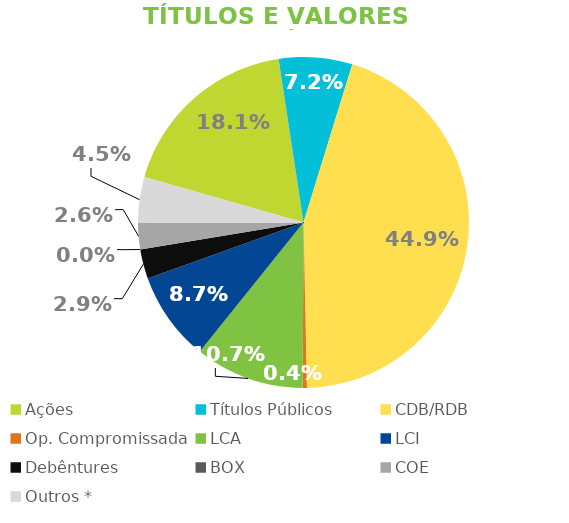
| Category | TVM |
|---|---|
| Ações | 0.181 |
| Títulos Públicos | 0.072 |
| CDB/RDB | 0.449 |
| Op. Compromissada | 0.004 |
| LCA | 0.107 |
| LCI | 0.087 |
| Debêntures | 0.029 |
| BOX | 0 |
| COE | 0.026 |
| Outros * | 0.045 |